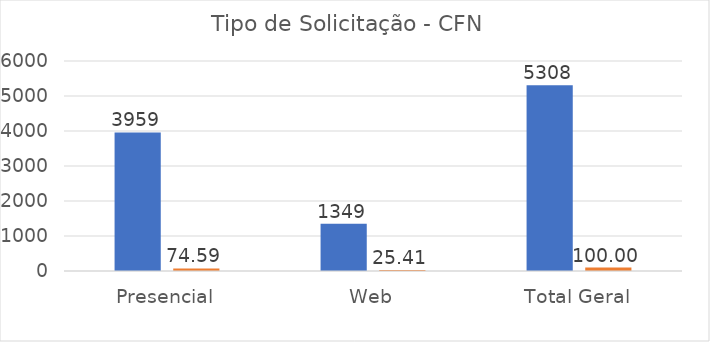
| Category | Series 0 | Series 1 |
|---|---|---|
| Presencial | 3959 | 74.586 |
| Web | 1349 | 25.414 |
| Total Geral | 5308 | 100 |